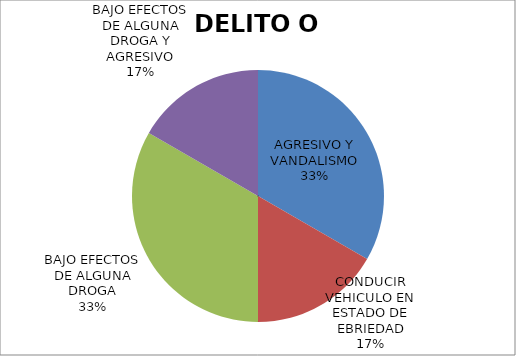
| Category | Series 0 |
|---|---|
| AGRESIVO Y VANDALISMO | 2 |
| CONDUCIR VEHICULO EN ESTADO DE EBRIEDAD | 1 |
| BAJO EFECTOS DE ALGUNA DROGA | 2 |
| BAJO EFECTOS DE ALGUNA DROGA Y AGRESIVO | 1 |